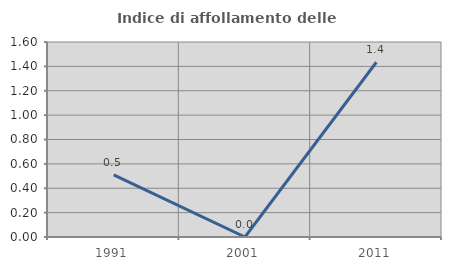
| Category | Indice di affollamento delle abitazioni  |
|---|---|
| 1991.0 | 0.51 |
| 2001.0 | 0 |
| 2011.0 | 1.434 |